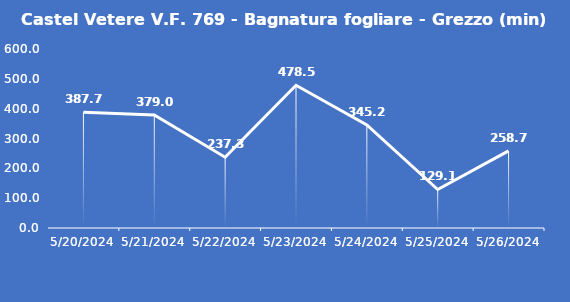
| Category | Castel Vetere V.F. 769 - Bagnatura fogliare - Grezzo (min) |
|---|---|
| 5/20/24 | 387.7 |
| 5/21/24 | 379 |
| 5/22/24 | 237.3 |
| 5/23/24 | 478.5 |
| 5/24/24 | 345.2 |
| 5/25/24 | 129.1 |
| 5/26/24 | 258.7 |